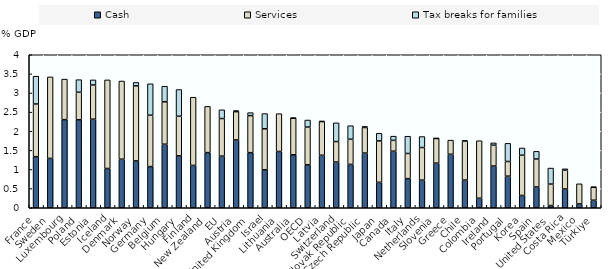
| Category | Cash | Services | Tax breaks for families |
|---|---|---|---|
| France | 1.336 | 1.377 | 0.727 |
| Sweden | 1.29 | 2.131 | 0 |
| Luxembourg | 2.304 | 1.059 | 0 |
| Poland | 2.3 | 0.72 | 0.329 |
| Estonia | 2.316 | 0.894 | 0.133 |
| Iceland | 1.026 | 2.317 | 0 |
| Denmark | 1.269 | 2.044 | 0 |
| Norway | 1.225 | 1.962 | 0.09 |
| Germany | 1.076 | 1.344 | 0.821 |
| Belgium | 1.661 | 1.109 | 0.405 |
| Hungary | 1.357 | 1.035 | 0.698 |
| Finland | 1.107 | 1.783 | 0 |
| New Zealand | 1.442 | 1.208 | 0 |
| EU | 1.35 | 0.983 | 0.228 |
| Austria | 1.773 | 0.74 | 0.028 |
| United Kingdom | 1.441 | 0.968 | 0.078 |
| Israel | 0.992 | 1.073 | 0.397 |
| Lithuania | 1.471 | 0.989 | 0 |
| Australia | 1.385 | 0.959 | 0 |
| OECD | 1.122 | 0.986 | 0.185 |
| Latvia | 1.372 | 0.881 | 0.013 |
| Switzerland | 1.195 | 0.536 | 0.49 |
| Slovak Republic | 1.133 | 0.658 | 0.354 |
| Czech Republic | 1.429 | 0.669 | 0.028 |
| Japan | 0.664 | 1.084 | 0.199 |
| Canada | 1.478 | 0.284 | 0.11 |
| Italy | 0.762 | 0.657 | 0.452 |
| Netherlands | 0.722 | 0.853 | 0.287 |
| Slovenia | 1.166 | 0.647 | 0.001 |
| Greece | 1.398 | 0.37 | 0 |
| Chile | 0.724 | 1.021 | 0.013 |
| Colombia | 0.25 | 1.503 | 0 |
| Ireland | 1.091 | 0.544 | 0.06 |
| Portugal | 0.826 | 0.383 | 0.475 |
| Korea | 0.322 | 1.052 | 0.188 |
| Spain | 0.543 | 0.731 | 0.201 |
| United States | 0.057 | 0.561 | 0.419 |
| Costa Rica | 0.491 | 0.489 | 0.037 |
| Mexico | 0.1 | 0.526 | 0 |
| Türkiye | 0.197 | 0.341 | 0.003 |